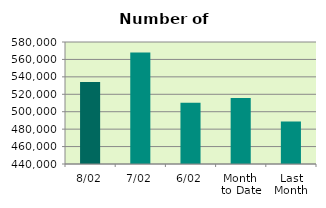
| Category | Series 0 |
|---|---|
| 8/02 | 534190 |
| 7/02 | 568086 |
| 6/02 | 510344 |
| Month 
to Date | 515759.667 |
| Last
Month | 488780.727 |